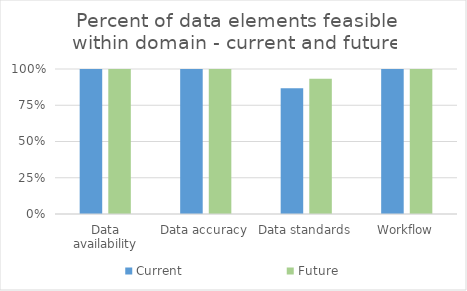
| Category | Current | Future |
|---|---|---|
| Data availability | 1 | 1 |
| Data accuracy | 1 | 1 |
| Data standards | 0.867 | 0.933 |
| Workflow | 1 | 1 |